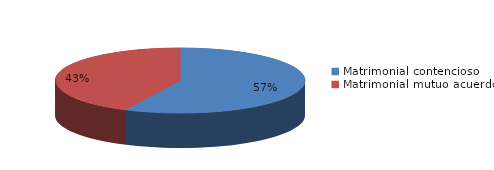
| Category | Series 0 |
|---|---|
| 0 | 1764 |
| 1 | 1326 |